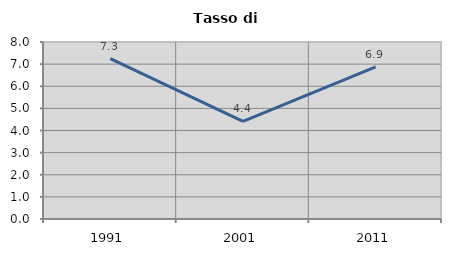
| Category | Tasso di disoccupazione   |
|---|---|
| 1991.0 | 7.251 |
| 2001.0 | 4.408 |
| 2011.0 | 6.878 |